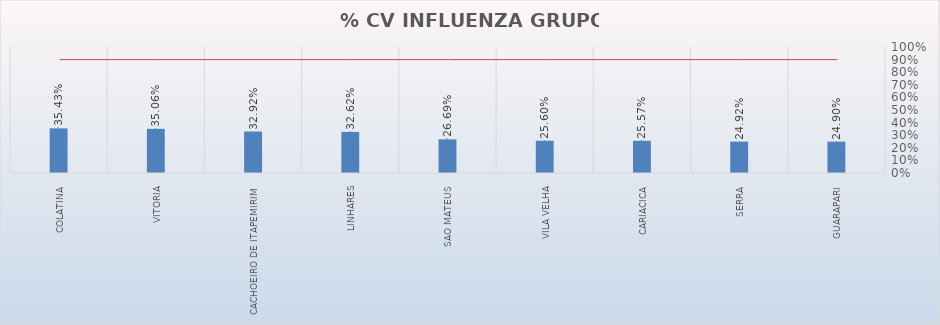
| Category | % CV INFLUENZA |
|---|---|
| COLATINA | 0.354 |
| VITORIA | 0.351 |
| CACHOEIRO DE ITAPEMIRIM | 0.329 |
| LINHARES | 0.326 |
| SAO MATEUS | 0.267 |
| VILA VELHA | 0.256 |
| CARIACICA | 0.256 |
| SERRA | 0.249 |
| GUARAPARI | 0.249 |